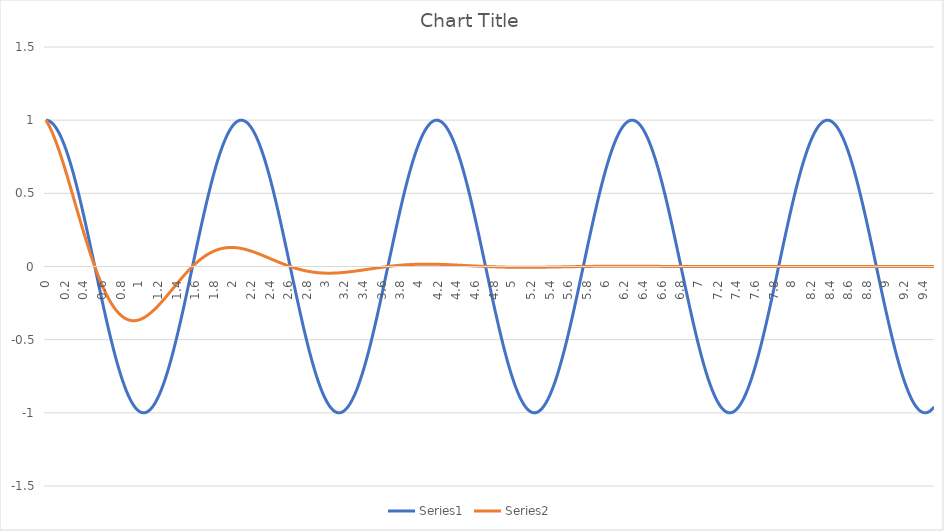
| Category | Series 0 | Series 1 |
|---|---|---|
| 0.0 | 1 | 1 |
| 0.02 | 0.998 | 0.978 |
| 0.04 | 0.993 | 0.954 |
| 0.06 | 0.984 | 0.927 |
| 0.08 | 0.971 | 0.897 |
| 0.1 | 0.955 | 0.864 |
| 0.12000000000000001 | 0.936 | 0.83 |
| 0.14 | 0.913 | 0.794 |
| 0.16 | 0.887 | 0.756 |
| 0.18 | 0.858 | 0.716 |
| 0.19999999999999998 | 0.825 | 0.676 |
| 0.21999999999999997 | 0.79 | 0.634 |
| 0.23999999999999996 | 0.752 | 0.591 |
| 0.25999999999999995 | 0.711 | 0.548 |
| 0.27999999999999997 | 0.667 | 0.504 |
| 0.3 | 0.622 | 0.46 |
| 0.32 | 0.574 | 0.416 |
| 0.34 | 0.523 | 0.373 |
| 0.36000000000000004 | 0.471 | 0.329 |
| 0.38000000000000006 | 0.418 | 0.286 |
| 0.4000000000000001 | 0.362 | 0.243 |
| 0.4200000000000001 | 0.306 | 0.201 |
| 0.4400000000000001 | 0.248 | 0.16 |
| 0.46000000000000013 | 0.19 | 0.12 |
| 0.48000000000000015 | 0.13 | 0.081 |
| 0.5000000000000001 | 0.071 | 0.043 |
| 0.5200000000000001 | 0.011 | 0.006 |
| 0.5400000000000001 | -0.049 | -0.029 |
| 0.5600000000000002 | -0.109 | -0.062 |
| 0.5800000000000002 | -0.168 | -0.094 |
| 0.6000000000000002 | -0.227 | -0.125 |
| 0.6200000000000002 | -0.285 | -0.153 |
| 0.6400000000000002 | -0.342 | -0.18 |
| 0.6600000000000003 | -0.398 | -0.206 |
| 0.6800000000000003 | -0.452 | -0.229 |
| 0.7000000000000003 | -0.505 | -0.251 |
| 0.7200000000000003 | -0.556 | -0.27 |
| 0.7400000000000003 | -0.605 | -0.288 |
| 0.7600000000000003 | -0.651 | -0.305 |
| 0.7800000000000004 | -0.696 | -0.319 |
| 0.8000000000000004 | -0.737 | -0.331 |
| 0.8200000000000004 | -0.777 | -0.342 |
| 0.8400000000000004 | -0.813 | -0.351 |
| 0.8600000000000004 | -0.846 | -0.358 |
| 0.8800000000000004 | -0.877 | -0.364 |
| 0.9000000000000005 | -0.904 | -0.368 |
| 0.9200000000000005 | -0.928 | -0.37 |
| 0.9400000000000005 | -0.949 | -0.371 |
| 0.9600000000000005 | -0.966 | -0.37 |
| 0.9800000000000005 | -0.98 | -0.368 |
| 1.0000000000000004 | -0.99 | -0.364 |
| 1.0200000000000005 | -0.997 | -0.359 |
| 1.0400000000000005 | -1 | -0.353 |
| 1.0600000000000005 | -0.999 | -0.346 |
| 1.0800000000000005 | -0.995 | -0.338 |
| 1.1000000000000005 | -0.987 | -0.329 |
| 1.1200000000000006 | -0.976 | -0.319 |
| 1.1400000000000006 | -0.961 | -0.308 |
| 1.1600000000000006 | -0.943 | -0.296 |
| 1.1800000000000006 | -0.922 | -0.283 |
| 1.2000000000000006 | -0.897 | -0.27 |
| 1.2200000000000006 | -0.869 | -0.256 |
| 1.2400000000000007 | -0.837 | -0.242 |
| 1.2600000000000007 | -0.803 | -0.228 |
| 1.2800000000000007 | -0.766 | -0.213 |
| 1.3000000000000007 | -0.726 | -0.198 |
| 1.3200000000000007 | -0.683 | -0.183 |
| 1.3400000000000007 | -0.638 | -0.167 |
| 1.3600000000000008 | -0.591 | -0.152 |
| 1.3800000000000008 | -0.542 | -0.136 |
| 1.4000000000000008 | -0.49 | -0.121 |
| 1.4200000000000008 | -0.437 | -0.106 |
| 1.4400000000000008 | -0.382 | -0.091 |
| 1.4600000000000009 | -0.326 | -0.076 |
| 1.4800000000000009 | -0.269 | -0.061 |
| 1.5000000000000009 | -0.211 | -0.047 |
| 1.520000000000001 | -0.152 | -0.033 |
| 1.540000000000001 | -0.092 | -0.02 |
| 1.560000000000001 | -0.032 | -0.007 |
| 1.580000000000001 | 0.028 | 0.006 |
| 1.600000000000001 | 0.087 | 0.018 |
| 1.620000000000001 | 0.147 | 0.029 |
| 1.640000000000001 | 0.206 | 0.04 |
| 1.660000000000001 | 0.264 | 0.05 |
| 1.680000000000001 | 0.322 | 0.06 |
| 1.700000000000001 | 0.378 | 0.069 |
| 1.720000000000001 | 0.433 | 0.078 |
| 1.740000000000001 | 0.486 | 0.085 |
| 1.7600000000000011 | 0.538 | 0.092 |
| 1.7800000000000011 | 0.587 | 0.099 |
| 1.8000000000000012 | 0.635 | 0.105 |
| 1.8200000000000012 | 0.68 | 0.11 |
| 1.8400000000000012 | 0.723 | 0.115 |
| 1.8600000000000012 | 0.763 | 0.119 |
| 1.8800000000000012 | 0.8 | 0.122 |
| 1.9000000000000012 | 0.835 | 0.125 |
| 1.9200000000000013 | 0.866 | 0.127 |
| 1.9400000000000013 | 0.895 | 0.129 |
| 1.9600000000000013 | 0.92 | 0.13 |
| 1.9800000000000013 | 0.942 | 0.13 |
| 2.0000000000000013 | 0.96 | 0.13 |
| 2.0200000000000014 | 0.975 | 0.129 |
| 2.0400000000000014 | 0.987 | 0.128 |
| 2.0600000000000014 | 0.995 | 0.127 |
| 2.0800000000000014 | 0.999 | 0.125 |
| 2.1000000000000014 | 1 | 0.122 |
| 2.1200000000000014 | 0.997 | 0.12 |
| 2.1400000000000015 | 0.991 | 0.117 |
| 2.1600000000000015 | 0.981 | 0.113 |
| 2.1800000000000015 | 0.967 | 0.109 |
| 2.2000000000000015 | 0.95 | 0.105 |
| 2.2200000000000015 | 0.93 | 0.101 |
| 2.2400000000000015 | 0.906 | 0.096 |
| 2.2600000000000016 | 0.879 | 0.092 |
| 2.2800000000000016 | 0.849 | 0.087 |
| 2.3000000000000016 | 0.816 | 0.082 |
| 2.3200000000000016 | 0.78 | 0.077 |
| 2.3400000000000016 | 0.741 | 0.071 |
| 2.3600000000000017 | 0.699 | 0.066 |
| 2.3800000000000017 | 0.655 | 0.061 |
| 2.4000000000000017 | 0.608 | 0.055 |
| 2.4200000000000017 | 0.56 | 0.05 |
| 2.4400000000000017 | 0.509 | 0.044 |
| 2.4600000000000017 | 0.456 | 0.039 |
| 2.4800000000000018 | 0.402 | 0.034 |
| 2.5000000000000018 | 0.347 | 0.028 |
| 2.520000000000002 | 0.29 | 0.023 |
| 2.540000000000002 | 0.232 | 0.018 |
| 2.560000000000002 | 0.173 | 0.013 |
| 2.580000000000002 | 0.114 | 0.009 |
| 2.600000000000002 | 0.054 | 0.004 |
| 2.620000000000002 | -0.006 | 0 |
| 2.640000000000002 | -0.066 | -0.005 |
| 2.660000000000002 | -0.126 | -0.009 |
| 2.680000000000002 | -0.185 | -0.013 |
| 2.700000000000002 | -0.244 | -0.016 |
| 2.720000000000002 | -0.301 | -0.02 |
| 2.740000000000002 | -0.358 | -0.023 |
| 2.760000000000002 | -0.413 | -0.026 |
| 2.780000000000002 | -0.467 | -0.029 |
| 2.800000000000002 | -0.519 | -0.032 |
| 2.820000000000002 | -0.57 | -0.034 |
| 2.840000000000002 | -0.618 | -0.036 |
| 2.860000000000002 | -0.664 | -0.038 |
| 2.880000000000002 | -0.708 | -0.04 |
| 2.900000000000002 | -0.749 | -0.041 |
| 2.920000000000002 | -0.787 | -0.042 |
| 2.940000000000002 | -0.823 | -0.043 |
| 2.960000000000002 | -0.855 | -0.044 |
| 2.980000000000002 | -0.885 | -0.045 |
| 3.000000000000002 | -0.911 | -0.045 |
| 3.0200000000000022 | -0.934 | -0.046 |
| 3.0400000000000023 | -0.954 | -0.046 |
| 3.0600000000000023 | -0.97 | -0.045 |
| 3.0800000000000023 | -0.983 | -0.045 |
| 3.1000000000000023 | -0.992 | -0.045 |
| 3.1200000000000023 | -0.998 | -0.044 |
| 3.1400000000000023 | -1 | -0.043 |
| 3.1600000000000024 | -0.998 | -0.042 |
| 3.1800000000000024 | -0.993 | -0.041 |
| 3.2000000000000024 | -0.985 | -0.04 |
| 3.2200000000000024 | -0.972 | -0.039 |
| 3.2400000000000024 | -0.957 | -0.037 |
| 3.2600000000000025 | -0.938 | -0.036 |
| 3.2800000000000025 | -0.915 | -0.034 |
| 3.3000000000000025 | -0.889 | -0.033 |
| 3.3200000000000025 | -0.86 | -0.031 |
| 3.3400000000000025 | -0.828 | -0.029 |
| 3.3600000000000025 | -0.793 | -0.028 |
| 3.3800000000000026 | -0.755 | -0.026 |
| 3.4000000000000026 | -0.714 | -0.024 |
| 3.4200000000000026 | -0.671 | -0.022 |
| 3.4400000000000026 | -0.625 | -0.02 |
| 3.4600000000000026 | -0.577 | -0.018 |
| 3.4800000000000026 | -0.527 | -0.016 |
| 3.5000000000000027 | -0.476 | -0.014 |
| 3.5200000000000027 | -0.422 | -0.012 |
| 3.5400000000000027 | -0.367 | -0.011 |
| 3.5600000000000027 | -0.31 | -0.009 |
| 3.5800000000000027 | -0.253 | -0.007 |
| 3.6000000000000028 | -0.194 | -0.005 |
| 3.6200000000000028 | -0.135 | -0.004 |
| 3.640000000000003 | -0.076 | -0.002 |
| 3.660000000000003 | -0.016 | 0 |
| 3.680000000000003 | 0.044 | 0.001 |
| 3.700000000000003 | 0.104 | 0.003 |
| 3.720000000000003 | 0.164 | 0.004 |
| 3.740000000000003 | 0.223 | 0.005 |
| 3.760000000000003 | 0.281 | 0.007 |
| 3.780000000000003 | 0.338 | 0.008 |
| 3.800000000000003 | 0.393 | 0.009 |
| 3.820000000000003 | 0.448 | 0.01 |
| 3.840000000000003 | 0.501 | 0.011 |
| 3.860000000000003 | 0.552 | 0.012 |
| 3.880000000000003 | 0.601 | 0.012 |
| 3.900000000000003 | 0.648 | 0.013 |
| 3.920000000000003 | 0.692 | 0.014 |
| 3.940000000000003 | 0.734 | 0.014 |
| 3.960000000000003 | 0.774 | 0.015 |
| 3.980000000000003 | 0.81 | 0.015 |
| 4.000000000000003 | 0.844 | 0.015 |
| 4.020000000000002 | 0.875 | 0.016 |
| 4.040000000000002 | 0.902 | 0.016 |
| 4.060000000000001 | 0.926 | 0.016 |
| 4.080000000000001 | 0.947 | 0.016 |
| 4.1000000000000005 | 0.965 | 0.016 |
| 4.12 | 0.979 | 0.016 |
| 4.14 | 0.989 | 0.016 |
| 4.159999999999999 | 0.996 | 0.016 |
| 4.179999999999999 | 1 | 0.015 |
| 4.199999999999998 | 0.999 | 0.015 |
| 4.219999999999998 | 0.996 | 0.015 |
| 4.2399999999999975 | 0.988 | 0.014 |
| 4.259999999999997 | 0.977 | 0.014 |
| 4.279999999999997 | 0.963 | 0.013 |
| 4.299999999999996 | 0.945 | 0.013 |
| 4.319999999999996 | 0.924 | 0.012 |
| 4.339999999999995 | 0.899 | 0.012 |
| 4.359999999999995 | 0.871 | 0.011 |
| 4.379999999999995 | 0.84 | 0.011 |
| 4.399999999999994 | 0.806 | 0.01 |
| 4.419999999999994 | 0.769 | 0.009 |
| 4.439999999999993 | 0.729 | 0.009 |
| 4.459999999999993 | 0.687 | 0.008 |
| 4.479999999999992 | 0.642 | 0.007 |
| 4.499999999999992 | 0.595 | 0.007 |
| 4.519999999999992 | 0.546 | 0.006 |
| 4.539999999999991 | 0.494 | 0.005 |
| 4.559999999999991 | 0.441 | 0.005 |
| 4.57999999999999 | 0.387 | 0.004 |
| 4.59999999999999 | 0.331 | 0.003 |
| 4.6199999999999894 | 0.274 | 0.003 |
| 4.639999999999989 | 0.215 | 0.002 |
| 4.659999999999989 | 0.157 | 0.001 |
| 4.679999999999988 | 0.097 | 0.001 |
| 4.699999999999988 | 0.037 | 0 |
| 4.719999999999987 | -0.023 | 0 |
| 4.739999999999987 | -0.083 | -0.001 |
| 4.7599999999999865 | -0.142 | -0.001 |
| 4.779999999999986 | -0.201 | -0.002 |
| 4.799999999999986 | -0.26 | -0.002 |
| 4.819999999999985 | -0.317 | -0.003 |
| 4.839999999999985 | -0.374 | -0.003 |
| 4.859999999999984 | -0.429 | -0.003 |
| 4.879999999999984 | -0.482 | -0.004 |
| 4.8999999999999835 | -0.534 | -0.004 |
| 4.919999999999983 | -0.583 | -0.004 |
| 4.939999999999983 | -0.631 | -0.005 |
| 4.959999999999982 | -0.676 | -0.005 |
| 4.979999999999982 | -0.719 | -0.005 |
| 4.999999999999981 | -0.76 | -0.005 |
| 5.019999999999981 | -0.797 | -0.005 |
| 5.0399999999999805 | -0.832 | -0.005 |
| 5.05999999999998 | -0.864 | -0.005 |
| 5.07999999999998 | -0.892 | -0.006 |
| 5.099999999999979 | -0.918 | -0.006 |
| 5.119999999999979 | -0.94 | -0.006 |
| 5.139999999999978 | -0.959 | -0.006 |
| 5.159999999999978 | -0.974 | -0.006 |
| 5.1799999999999775 | -0.986 | -0.006 |
| 5.199999999999977 | -0.994 | -0.005 |
| 5.219999999999977 | -0.999 | -0.005 |
| 5.239999999999976 | -1 | -0.005 |
| 5.259999999999976 | -0.997 | -0.005 |
| 5.279999999999975 | -0.991 | -0.005 |
| 5.299999999999975 | -0.982 | -0.005 |
| 5.3199999999999745 | -0.968 | -0.005 |
| 5.339999999999974 | -0.952 | -0.005 |
| 5.359999999999974 | -0.932 | -0.004 |
| 5.379999999999973 | -0.908 | -0.004 |
| 5.399999999999973 | -0.881 | -0.004 |
| 5.419999999999972 | -0.851 | -0.004 |
| 5.439999999999972 | -0.818 | -0.004 |
| 5.4599999999999715 | -0.783 | -0.003 |
| 5.479999999999971 | -0.744 | -0.003 |
| 5.499999999999971 | -0.702 | -0.003 |
| 5.51999999999997 | -0.658 | -0.003 |
| 5.53999999999997 | -0.612 | -0.002 |
| 5.559999999999969 | -0.564 | -0.002 |
| 5.579999999999969 | -0.513 | -0.002 |
| 5.599999999999969 | -0.461 | -0.002 |
| 5.619999999999968 | -0.407 | -0.001 |
| 5.639999999999968 | -0.351 | -0.001 |
| 5.659999999999967 | -0.294 | -0.001 |
| 5.679999999999967 | -0.236 | -0.001 |
| 5.699999999999966 | -0.178 | -0.001 |
| 5.719999999999966 | -0.118 | 0 |
| 5.739999999999966 | -0.059 | 0 |
| 5.759999999999965 | 0.001 | 0 |
| 5.779999999999965 | 0.061 | 0 |
| 5.799999999999964 | 0.121 | 0 |
| 5.819999999999964 | 0.18 | 0.001 |
| 5.839999999999963 | 0.239 | 0.001 |
| 5.859999999999963 | 0.297 | 0.001 |
| 5.879999999999963 | 0.353 | 0.001 |
| 5.899999999999962 | 0.409 | 0.001 |
| 5.919999999999962 | 0.463 | 0.001 |
| 5.939999999999961 | 0.515 | 0.001 |
| 5.959999999999961 | 0.566 | 0.001 |
| 5.9799999999999605 | 0.614 | 0.002 |
| 5.99999999999996 | 0.66 | 0.002 |
| 6.01999999999996 | 0.704 | 0.002 |
| 6.039999999999959 | 0.745 | 0.002 |
| 6.059999999999959 | 0.784 | 0.002 |
| 6.079999999999958 | 0.82 | 0.002 |
| 6.099999999999958 | 0.853 | 0.002 |
| 6.1199999999999575 | 0.883 | 0.002 |
| 6.139999999999957 | 0.909 | 0.002 |
| 6.159999999999957 | 0.932 | 0.002 |
| 6.179999999999956 | 0.952 | 0.002 |
| 6.199999999999956 | 0.969 | 0.002 |
| 6.219999999999955 | 0.982 | 0.002 |
| 6.239999999999955 | 0.992 | 0.002 |
| 6.2599999999999545 | 0.998 | 0.002 |
| 6.279999999999954 | 1 | 0.002 |
| 6.299999999999954 | 0.999 | 0.002 |
| 6.319999999999953 | 0.994 | 0.002 |
| 6.339999999999953 | 0.986 | 0.002 |
| 6.359999999999952 | 0.974 | 0.002 |
| 6.379999999999952 | 0.958 | 0.002 |
| 6.3999999999999515 | 0.939 | 0.002 |
| 6.419999999999951 | 0.917 | 0.001 |
| 6.439999999999951 | 0.891 | 0.001 |
| 6.45999999999995 | 0.863 | 0.001 |
| 6.47999999999995 | 0.831 | 0.001 |
| 6.499999999999949 | 0.796 | 0.001 |
| 6.519999999999949 | 0.758 | 0.001 |
| 6.5399999999999485 | 0.718 | 0.001 |
| 6.559999999999948 | 0.675 | 0.001 |
| 6.579999999999948 | 0.629 | 0.001 |
| 6.599999999999947 | 0.581 | 0.001 |
| 6.619999999999947 | 0.531 | 0.001 |
| 6.639999999999946 | 0.48 | 0.001 |
| 6.659999999999946 | 0.426 | 0.001 |
| 6.6799999999999455 | 0.371 | 0 |
| 6.699999999999945 | 0.315 | 0 |
| 6.719999999999945 | 0.257 | 0 |
| 6.739999999999944 | 0.199 | 0 |
| 6.759999999999944 | 0.14 | 0 |
| 6.779999999999943 | 0.08 | 0 |
| 6.799999999999943 | 0.02 | 0 |
| 6.8199999999999426 | -0.04 | 0 |
| 6.839999999999942 | -0.099 | 0 |
| 6.859999999999942 | -0.159 | 0 |
| 6.879999999999941 | -0.218 | 0 |
| 6.899999999999941 | -0.276 | 0 |
| 6.91999999999994 | -0.333 | 0 |
| 6.93999999999994 | -0.389 | 0 |
| 6.95999999999994 | -0.444 | 0 |
| 6.979999999999939 | -0.497 | 0 |
| 6.999999999999939 | -0.548 | 0 |
| 7.019999999999938 | -0.597 | -0.001 |
| 7.039999999999938 | -0.644 | -0.001 |
| 7.059999999999937 | -0.689 | -0.001 |
| 7.079999999999937 | -0.731 | -0.001 |
| 7.099999999999937 | -0.771 | -0.001 |
| 7.119999999999936 | -0.807 | -0.001 |
| 7.139999999999936 | -0.841 | -0.001 |
| 7.159999999999935 | -0.872 | -0.001 |
| 7.179999999999935 | -0.9 | -0.001 |
| 7.1999999999999345 | -0.924 | -0.001 |
| 7.219999999999934 | -0.946 | -0.001 |
| 7.239999999999934 | -0.963 | -0.001 |
| 7.259999999999933 | -0.978 | -0.001 |
| 7.279999999999933 | -0.989 | -0.001 |
| 7.299999999999932 | -0.996 | -0.001 |
| 7.319999999999932 | -1 | -0.001 |
| 7.3399999999999315 | -1 | -0.001 |
| 7.359999999999931 | -0.996 | -0.001 |
| 7.379999999999931 | -0.989 | -0.001 |
| 7.39999999999993 | -0.978 | -0.001 |
| 7.41999999999993 | -0.964 | -0.001 |
| 7.439999999999929 | -0.946 | -0.001 |
| 7.459999999999929 | -0.925 | -0.001 |
| 7.4799999999999285 | -0.901 | -0.001 |
| 7.499999999999928 | -0.873 | 0 |
| 7.519999999999928 | -0.843 | 0 |
| 7.539999999999927 | -0.809 | 0 |
| 7.559999999999927 | -0.772 | 0 |
| 7.579999999999926 | -0.732 | 0 |
| 7.599999999999926 | -0.69 | 0 |
| 7.6199999999999255 | -0.646 | 0 |
| 7.639999999999925 | -0.599 | 0 |
| 7.659999999999925 | -0.55 | 0 |
| 7.679999999999924 | -0.499 | 0 |
| 7.699999999999924 | -0.446 | 0 |
| 7.719999999999923 | -0.391 | 0 |
| 7.739999999999923 | -0.335 | 0 |
| 7.7599999999999225 | -0.278 | 0 |
| 7.779999999999922 | -0.22 | 0 |
| 7.799999999999922 | -0.161 | 0 |
| 7.819999999999921 | -0.102 | 0 |
| 7.839999999999921 | -0.042 | 0 |
| 7.85999999999992 | 0.018 | 0 |
| 7.87999999999992 | 0.078 | 0 |
| 7.8999999999999195 | 0.138 | 0 |
| 7.919999999999919 | 0.197 | 0 |
| 7.939999999999919 | 0.255 | 0 |
| 7.959999999999918 | 0.313 | 0 |
| 7.979999999999918 | 0.369 | 0 |
| 7.999999999999917 | 0.424 | 0 |
| 8.019999999999918 | 0.478 | 0 |
| 8.039999999999917 | 0.53 | 0 |
| 8.059999999999917 | 0.579 | 0 |
| 8.079999999999917 | 0.627 | 0 |
| 8.099999999999916 | 0.673 | 0 |
| 8.119999999999916 | 0.716 | 0 |
| 8.139999999999915 | 0.757 | 0 |
| 8.159999999999915 | 0.794 | 0 |
| 8.179999999999914 | 0.829 | 0 |
| 8.199999999999914 | 0.861 | 0 |
| 8.219999999999914 | 0.89 | 0 |
| 8.239999999999913 | 0.916 | 0 |
| 8.259999999999913 | 0.938 | 0 |
| 8.279999999999912 | 0.957 | 0 |
| 8.299999999999912 | 0.973 | 0 |
| 8.319999999999911 | 0.985 | 0 |
| 8.339999999999911 | 0.994 | 0 |
| 8.35999999999991 | 0.999 | 0 |
| 8.37999999999991 | 1 | 0 |
| 8.39999999999991 | 0.998 | 0 |
| 8.41999999999991 | 0.992 | 0 |
| 8.439999999999909 | 0.983 | 0 |
| 8.459999999999908 | 0.97 | 0 |
| 8.479999999999908 | 0.953 | 0 |
| 8.499999999999908 | 0.933 | 0 |
| 8.519999999999907 | 0.91 | 0 |
| 8.539999999999907 | 0.884 | 0 |
| 8.559999999999906 | 0.854 | 0 |
| 8.579999999999906 | 0.821 | 0 |
| 8.599999999999905 | 0.786 | 0 |
| 8.619999999999905 | 0.747 | 0 |
| 8.639999999999905 | 0.706 | 0 |
| 8.659999999999904 | 0.662 | 0 |
| 8.679999999999904 | 0.616 | 0 |
| 8.699999999999903 | 0.568 | 0 |
| 8.719999999999903 | 0.517 | 0 |
| 8.739999999999903 | 0.465 | 0 |
| 8.759999999999902 | 0.411 | 0 |
| 8.779999999999902 | 0.356 | 0 |
| 8.799999999999901 | 0.299 | 0 |
| 8.8199999999999 | 0.241 | 0 |
| 8.8399999999999 | 0.183 | 0 |
| 8.8599999999999 | 0.123 | 0 |
| 8.8799999999999 | 0.063 | 0 |
| 8.899999999999899 | 0.004 | 0 |
| 8.919999999999899 | -0.056 | 0 |
| 8.939999999999898 | -0.116 | 0 |
| 8.959999999999898 | -0.176 | 0 |
| 8.979999999999897 | -0.234 | 0 |
| 8.999999999999897 | -0.292 | 0 |
| 9.019999999999897 | -0.349 | 0 |
| 9.039999999999896 | -0.405 | 0 |
| 9.059999999999896 | -0.459 | 0 |
| 9.079999999999895 | -0.511 | 0 |
| 9.099999999999895 | -0.562 | 0 |
| 9.119999999999894 | -0.61 | 0 |
| 9.139999999999894 | -0.657 | 0 |
| 9.159999999999894 | -0.701 | 0 |
| 9.179999999999893 | -0.742 | 0 |
| 9.199999999999893 | -0.781 | 0 |
| 9.219999999999892 | -0.817 | 0 |
| 9.239999999999892 | -0.85 | 0 |
| 9.259999999999891 | -0.88 | 0 |
| 9.279999999999891 | -0.907 | 0 |
| 9.29999999999989 | -0.931 | 0 |
| 9.31999999999989 | -0.951 | 0 |
| 9.33999999999989 | -0.968 | 0 |
| 9.35999999999989 | -0.981 | 0 |
| 9.379999999999889 | -0.991 | 0 |
| 9.399999999999888 | -0.997 | 0 |
| 9.419999999999888 | -1 | 0 |
| 9.439999999999888 | -0.999 | 0 |
| 9.459999999999887 | -0.994 | 0 |
| 9.479999999999887 | -0.986 | 0 |
| 9.499999999999886 | -0.975 | 0 |
| 9.519999999999886 | -0.959 | 0 |